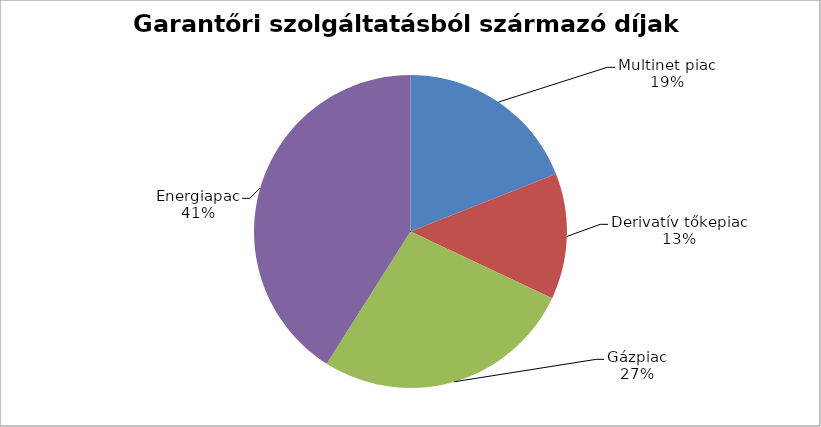
| Category | Series 0 |
|---|---|
| Multinet piac | 0.19 |
| Derivatív tőkepiac | 0.13 |
| Gázpiac | 0.27 |
| Energiapac | 0.41 |